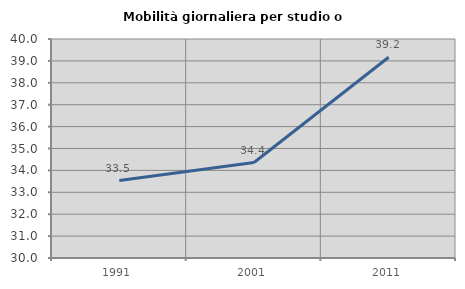
| Category | Mobilità giornaliera per studio o lavoro |
|---|---|
| 1991.0 | 33.539 |
| 2001.0 | 34.36 |
| 2011.0 | 39.168 |